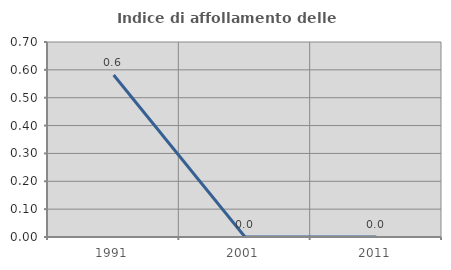
| Category | Indice di affollamento delle abitazioni  |
|---|---|
| 1991.0 | 0.581 |
| 2001.0 | 0 |
| 2011.0 | 0 |